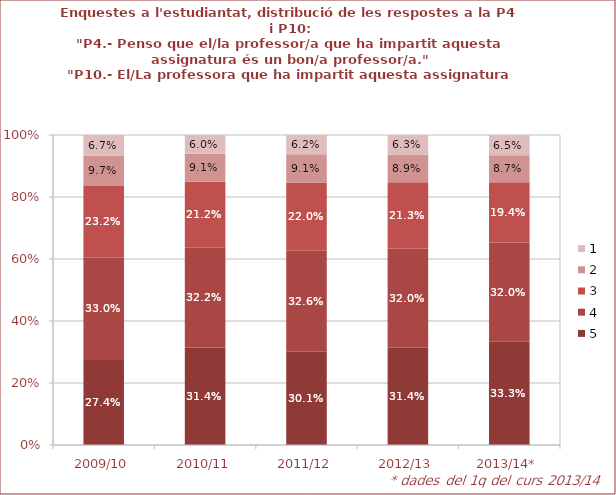
| Category | 5 | 4 | 3 | 2 | 1 |
|---|---|---|---|---|---|
| 2009/10 | 0.274 | 0.33 | 0.232 | 0.097 | 0.067 |
| 2010/11 | 0.314 | 0.322 | 0.212 | 0.091 | 0.06 |
| 2011/12 | 0.301 | 0.326 | 0.22 | 0.091 | 0.062 |
| 2012/13 | 0.314 | 0.32 | 0.213 | 0.089 | 0.063 |
| 2013/14* | 0.333 | 0.32 | 0.194 | 0.087 | 0.065 |